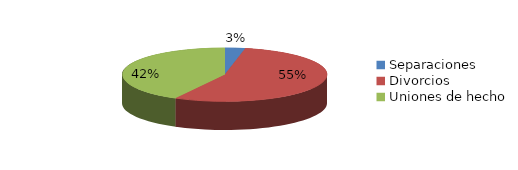
| Category | Series 0 |
|---|---|
| Separaciones | 46 |
| Divorcios | 783 |
| Uniones de hecho | 603 |